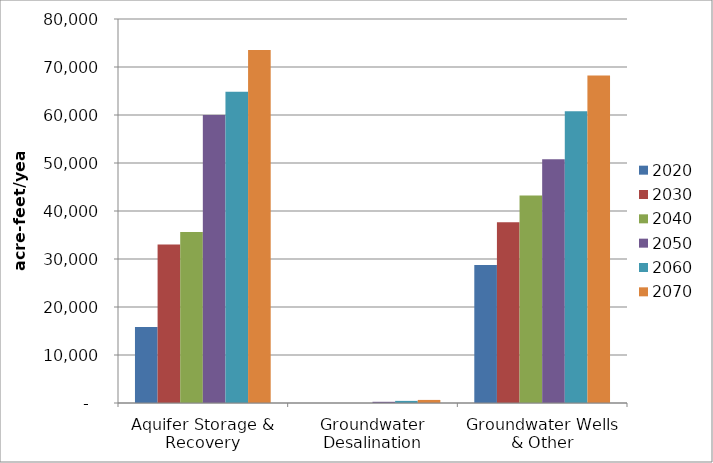
| Category | 2020 | 2030 | 2040 | 2050 | 2060 | 2070 |
|---|---|---|---|---|---|---|
| Aquifer Storage & Recovery | 15855 | 33019 | 35633 | 59974 | 64834 | 73553 |
| Groundwater Desalination | 0 | 0 | 0 | 251 | 440 | 641 |
| Groundwater Wells & Other | 28726 | 37658 | 43255 | 50758 | 60805 | 68207 |